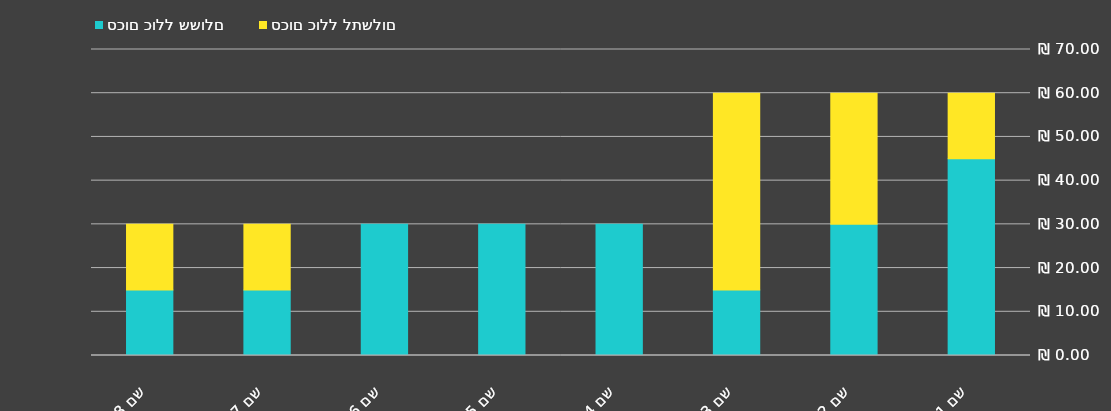
| Category | סכום כולל ששולם | סכום כולל לתשלום |
|---|---|---|
| שם 1 | 45 | 15 |
| שם 2 | 30 | 30 |
| שם 3 | 15 | 45 |
| שם 4 | 30 | 0 |
| שם 5 | 30 | 0 |
| שם 6 | 30 | 0 |
| שם 7 | 15 | 15 |
| שם 8 | 15 | 15 |